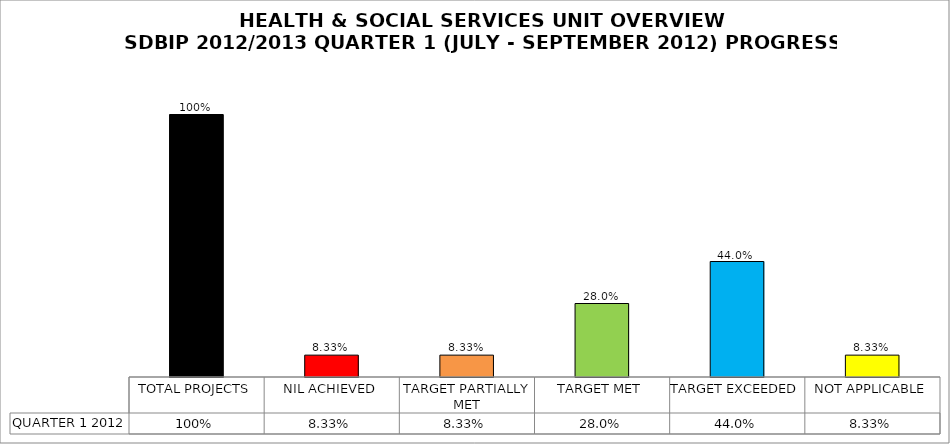
| Category | QUARTER 1 2012 |
|---|---|
| TOTAL PROJECTS | 1 |
| NIL ACHIEVED | 0.083 |
| TARGET PARTIALLY MET | 0.083 |
| TARGET MET | 0.28 |
| TARGET EXCEEDED | 0.44 |
| NOT APPLICABLE | 0.083 |